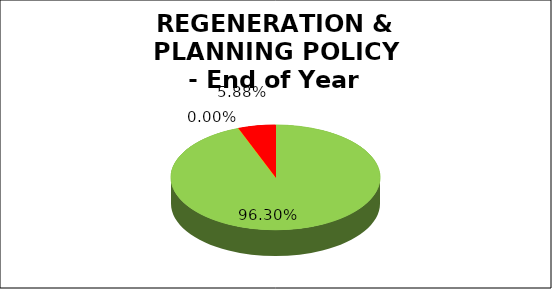
| Category | Q4 |
|---|---|
| Green | 0.963 |
| Amber | 0 |
| Red | 0.059 |